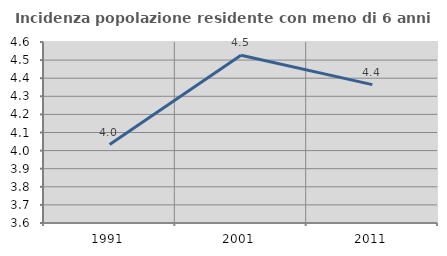
| Category | Incidenza popolazione residente con meno di 6 anni |
|---|---|
| 1991.0 | 4.033 |
| 2001.0 | 4.527 |
| 2011.0 | 4.365 |